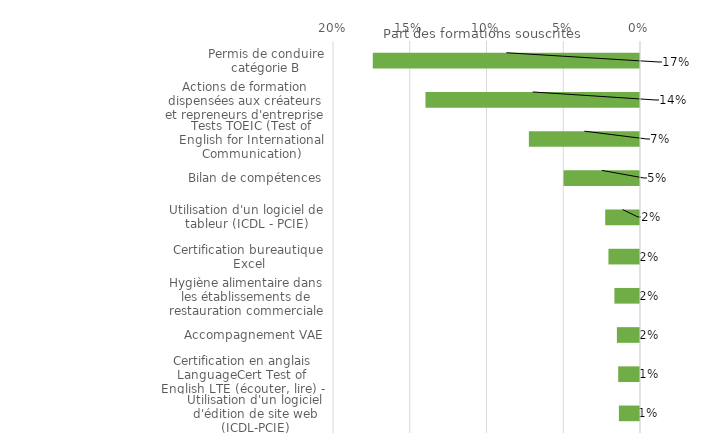
| Category | Series 0 |
|---|---|
| Permis de conduire catégorie B | 0.174 |
| Actions de formation dispensées aux créateurs et repreneurs d'entreprise | 0.14 |
| Tests TOEIC (Test of English for International Communication) | 0.072 |
| Bilan de compétences | 0.05 |
| Utilisation d'un logiciel de tableur (ICDL - PCIE) | 0.023 |
| Certification bureautique Excel | 0.021 |
| Hygiène alimentaire dans les établissements de restauration commerciale | 0.017 |
| Accompagnement VAE | 0.015 |
| Certification en anglais LanguageCert Test of English LTE (écouter, lire) - niveaux A1-C2 | 0.014 |
| Utilisation d'un logiciel d'édition de site web (ICDL-PCIE) | 0.014 |